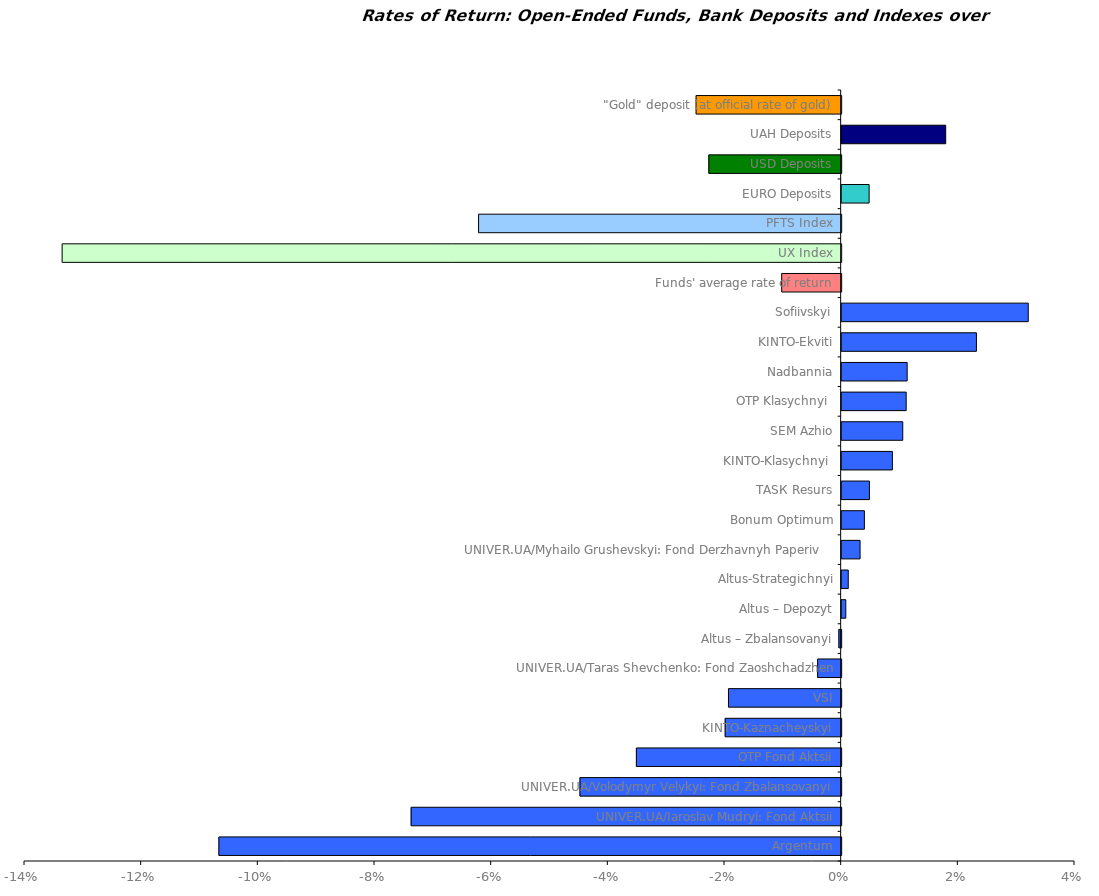
| Category | Series 0 |
|---|---|
| Argentum | -0.107 |
| UNIVER.UA/Iaroslav Mudryi: Fond Aktsii | -0.074 |
| UNIVER.UA/Volodymyr Velykyi: Fond Zbalansovanyi | -0.045 |
| OTP Fond Aktsii | -0.035 |
| KINTO-Kaznacheyskyi | -0.02 |
| VSI | -0.019 |
| UNIVER.UA/Taras Shevchenko: Fond Zaoshchadzhen | -0.004 |
| Altus – Zbalansovanyi | 0 |
| Altus – Depozyt | 0.001 |
| Altus-Strategichnyi | 0.001 |
| UNIVER.UA/Myhailo Grushevskyi: Fond Derzhavnyh Paperiv    | 0.003 |
| Bonum Optimum | 0.004 |
| ТАSК Resurs | 0.005 |
| KINTO-Klasychnyi  | 0.009 |
| SEM Azhio | 0.01 |
| OTP Klasychnyi  | 0.011 |
| Nadbannia | 0.011 |
| KINTO-Ekviti | 0.023 |
| Sofiivskyi | 0.032 |
| Funds' average rate of return | -0.01 |
| UX Index | -0.134 |
| PFTS Index | -0.062 |
| EURO Deposits | 0.005 |
| USD Deposits | -0.023 |
| UAH Deposits | 0.018 |
| "Gold" deposit (at official rate of gold) | -0.025 |